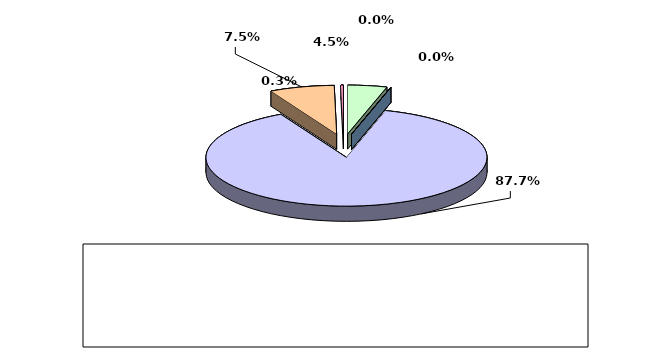
| Category | Series 0 |
|---|---|
| מזומנים ושווי מזומנים | 0.045 |
| אג"ח ממשלתיות סחירות | 0 |
| אג"ח קונצרני סחיר | 0 |
| ני"ע אחרים סחירים | 0.877 |
| פקדונות והלוואות | 0.075 |
| השקעות אחרות | 0.003 |